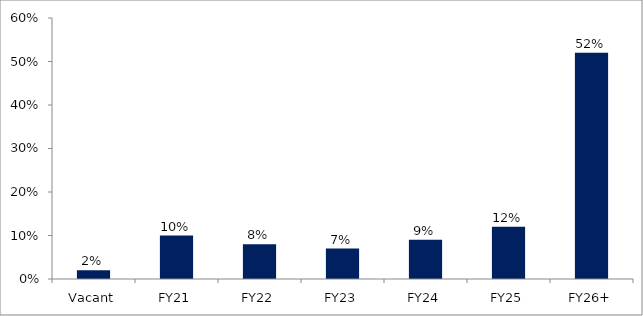
| Category | Series 0 |
|---|---|
| Vacant | 0.02 |
| FY21 | 0.1 |
| FY22 | 0.08 |
| FY23 | 0.07 |
| FY24 | 0.09 |
| FY25 | 0.12 |
| FY26+ | 0.52 |